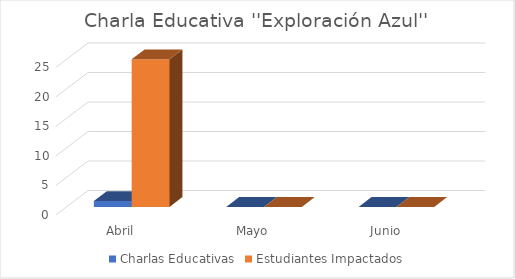
| Category | Charlas Educativas | Estudiantes Impactados |
|---|---|---|
| Abril | 1 | 25 |
| Mayo | 0 | 0 |
| Junio | 0 | 0 |